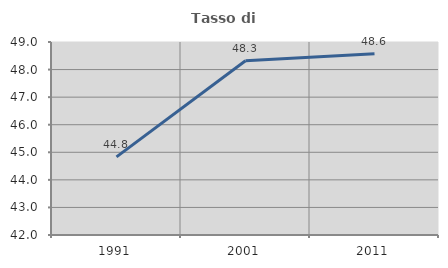
| Category | Tasso di occupazione   |
|---|---|
| 1991.0 | 44.834 |
| 2001.0 | 48.319 |
| 2011.0 | 48.571 |